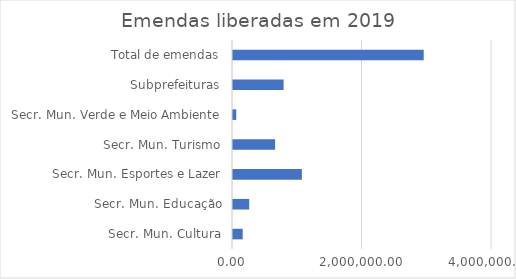
| Category | Series 0 |
|---|---|
| Secr. Mun. Cultura | 150000 |
| Secr. Mun. Educação | 250000 |
| Secr. Mun. Esportes e Lazer | 1063636 |
| Secr. Mun. Turismo | 650000 |
| Secr. Mun. Verde e Meio Ambiente | 50000 |
| Subprefeituras | 781818 |
| Total de emendas | 2945454 |